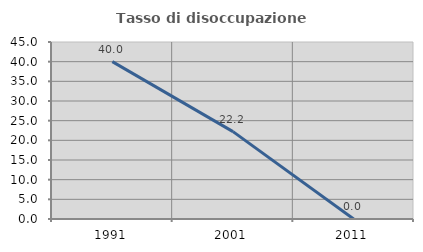
| Category | Tasso di disoccupazione giovanile  |
|---|---|
| 1991.0 | 40 |
| 2001.0 | 22.222 |
| 2011.0 | 0 |